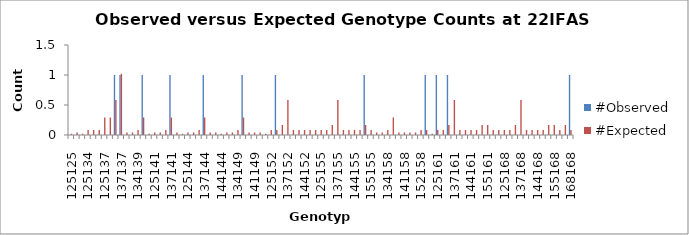
| Category | #Observed | #Expected |
|---|---|---|
| 125125.0 | 0 | 0.021 |
| 125130.0 | 0 | 0.042 |
| 130130.0 | 0 | 0.021 |
| 125134.0 | 0 | 0.083 |
| 130134.0 | 0 | 0.083 |
| 134134.0 | 0 | 0.083 |
| 125137.0 | 0 | 0.292 |
| 130137.0 | 0 | 0.292 |
| 134137.0 | 1 | 0.583 |
| 137137.0 | 1 | 1.021 |
| 125139.0 | 0 | 0.042 |
| 130139.0 | 0 | 0.042 |
| 134139.0 | 0 | 0.083 |
| 137139.0 | 1 | 0.292 |
| 139139.0 | 0 | 0.021 |
| 125141.0 | 0 | 0.042 |
| 130141.0 | 0 | 0.042 |
| 134141.0 | 0 | 0.083 |
| 137141.0 | 1 | 0.292 |
| 139141.0 | 0 | 0.042 |
| 141141.0 | 0 | 0.021 |
| 125144.0 | 0 | 0.042 |
| 130144.0 | 0 | 0.042 |
| 134144.0 | 0 | 0.083 |
| 137144.0 | 1 | 0.292 |
| 139144.0 | 0 | 0.042 |
| 141144.0 | 0 | 0.042 |
| 144144.0 | 0 | 0.021 |
| 125149.0 | 0 | 0.042 |
| 130149.0 | 0 | 0.042 |
| 134149.0 | 0 | 0.083 |
| 137149.0 | 1 | 0.292 |
| 139149.0 | 0 | 0.042 |
| 141149.0 | 0 | 0.042 |
| 144149.0 | 0 | 0.042 |
| 149149.0 | 0 | 0.021 |
| 125152.0 | 0 | 0.083 |
| 130152.0 | 1 | 0.083 |
| 134152.0 | 0 | 0.167 |
| 137152.0 | 0 | 0.583 |
| 139152.0 | 0 | 0.083 |
| 141152.0 | 0 | 0.083 |
| 144152.0 | 0 | 0.083 |
| 149152.0 | 0 | 0.083 |
| 152152.0 | 0 | 0.083 |
| 125155.0 | 0 | 0.083 |
| 130155.0 | 0 | 0.083 |
| 134155.0 | 0 | 0.167 |
| 137155.0 | 0 | 0.583 |
| 139155.0 | 0 | 0.083 |
| 141155.0 | 0 | 0.083 |
| 144155.0 | 0 | 0.083 |
| 149155.0 | 0 | 0.083 |
| 152155.0 | 1 | 0.167 |
| 155155.0 | 0 | 0.083 |
| 125158.0 | 0 | 0.042 |
| 130158.0 | 0 | 0.042 |
| 134158.0 | 0 | 0.083 |
| 137158.0 | 0 | 0.292 |
| 139158.0 | 0 | 0.042 |
| 141158.0 | 0 | 0.042 |
| 144158.0 | 0 | 0.042 |
| 149158.0 | 0 | 0.042 |
| 152158.0 | 0 | 0.083 |
| 155158.0 | 1 | 0.083 |
| 158158.0 | 0 | 0.021 |
| 125161.0 | 1 | 0.083 |
| 130161.0 | 0 | 0.083 |
| 134161.0 | 1 | 0.167 |
| 137161.0 | 0 | 0.583 |
| 139161.0 | 0 | 0.083 |
| 141161.0 | 0 | 0.083 |
| 144161.0 | 0 | 0.083 |
| 149161.0 | 0 | 0.083 |
| 152161.0 | 0 | 0.167 |
| 155161.0 | 0 | 0.167 |
| 158161.0 | 0 | 0.083 |
| 161161.0 | 0 | 0.083 |
| 125168.0 | 0 | 0.083 |
| 130168.0 | 0 | 0.083 |
| 134168.0 | 0 | 0.167 |
| 137168.0 | 0 | 0.583 |
| 139168.0 | 0 | 0.083 |
| 141168.0 | 0 | 0.083 |
| 144168.0 | 0 | 0.083 |
| 149168.0 | 0 | 0.083 |
| 152168.0 | 0 | 0.167 |
| 155168.0 | 0 | 0.167 |
| 158168.0 | 0 | 0.083 |
| 161168.0 | 0 | 0.167 |
| 168168.0 | 1 | 0.083 |